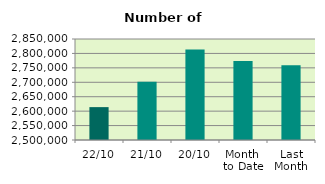
| Category | Series 0 |
|---|---|
| 22/10 | 2613930 |
| 21/10 | 2702010 |
| 20/10 | 2813576 |
| Month 
to Date | 2774138.875 |
| Last
Month | 2759252.364 |